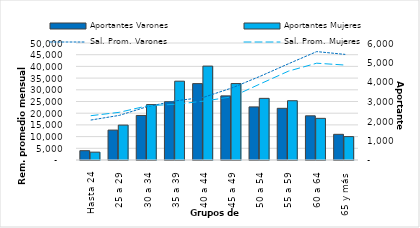
| Category | Aportantes Varones | Aportantes Mujeres |
|---|---|---|
| Hasta 24 | 478 | 403 |
| 25 a 29 | 1534 | 1790 |
| 30 a 34 | 2284 | 2842 |
| 35 a 39 | 2988 | 4042 |
| 40 a 44 | 3917 | 4815 |
| 45 a 49 | 3288 | 3920 |
| 50 a 54 | 2722 | 3161 |
| 55 a 59 | 2650 | 3040 |
| 60 a 64 | 2266 | 2136 |
| 65 y más | 1317 | 1199 |